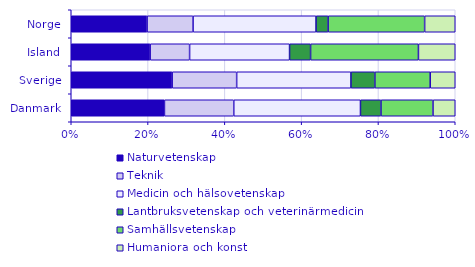
| Category | Naturvetenskap | Teknik | Medicin och hälsovetenskap | Lantbruksvetenskap och veterinärmedicin | Samhällsvetenskap | Humaniora och konst |
|---|---|---|---|---|---|---|
| 0 | 754 | 561 | 1025 | 166 | 421 | 180 |
| 1 | 11295 | 7219 | 12793 | 2679 | 6195 | 2800 |
| 2 | 30 | 15 | 38 | 8 | 41 | 14 |
| 3 | 528 | 320 | 856 | 84 | 672 | 213 |